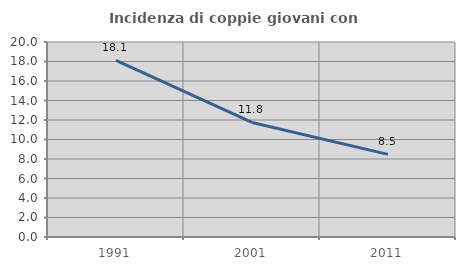
| Category | Incidenza di coppie giovani con figli |
|---|---|
| 1991.0 | 18.122 |
| 2001.0 | 11.75 |
| 2011.0 | 8.475 |